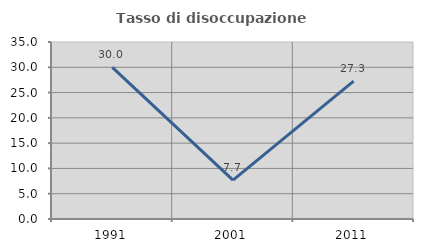
| Category | Tasso di disoccupazione giovanile  |
|---|---|
| 1991.0 | 30 |
| 2001.0 | 7.692 |
| 2011.0 | 27.273 |